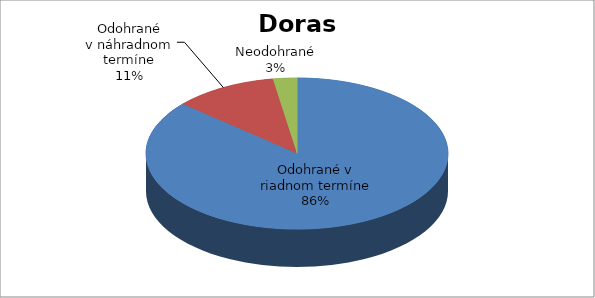
| Category | Series 0 |
|---|---|
| Odohrané v riadnom termíne | 405 |
| Odohrané v náhradnom termíne | 52 |
| Neodohrané | 12 |